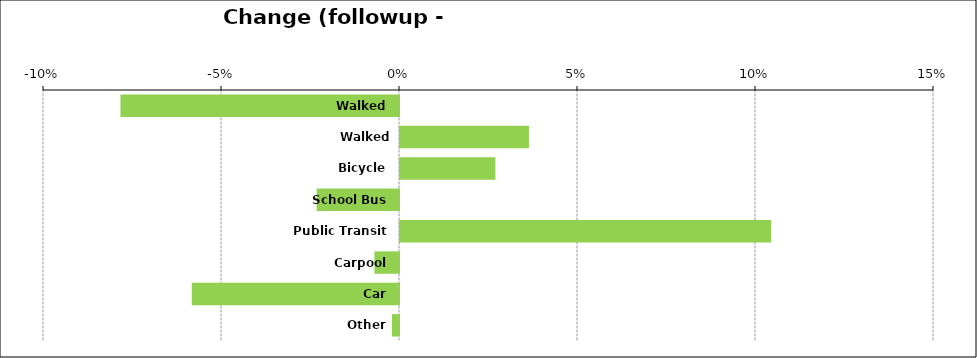
| Category | Change (followup - baseline) |
|---|---|
| Walked | -0.078 |
| Walked part-way | 0.036 |
| Bicycle | 0.027 |
| School Bus | -0.023 |
| Public Transit | 0.104 |
| Carpool | -0.007 |
| Car | -0.058 |
| Other | -0.002 |